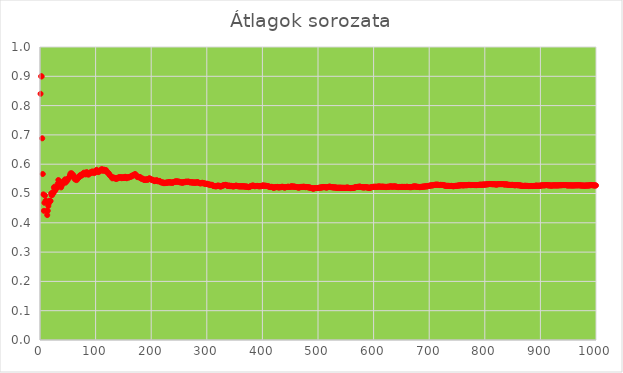
| Category | Series 0 |
|---|---|
| 1.0 | 0.84 |
| 2.0 | 0.9 |
| 3.0 | 0.899 |
| 4.0 | 0.688 |
| 5.0 | 0.566 |
| 6.0 | 0.497 |
| 7.0 | 0.441 |
| 8.0 | 0.468 |
| 9.0 | 0.493 |
| 10.0 | 0.475 |
| 11.0 | 0.475 |
| 12.0 | 0.441 |
| 13.0 | 0.426 |
| 14.0 | 0.441 |
| 15.0 | 0.457 |
| 16.0 | 0.467 |
| 17.0 | 0.475 |
| 18.0 | 0.475 |
| 19.0 | 0.474 |
| 20.0 | 0.5 |
| 21.0 | 0.494 |
| 22.0 | 0.495 |
| 23.0 | 0.505 |
| 24.0 | 0.501 |
| 25.0 | 0.52 |
| 26.0 | 0.523 |
| 27.0 | 0.509 |
| 28.0 | 0.516 |
| 29.0 | 0.517 |
| 30.0 | 0.517 |
| 31.0 | 0.524 |
| 32.0 | 0.534 |
| 33.0 | 0.546 |
| 34.0 | 0.532 |
| 35.0 | 0.532 |
| 36.0 | 0.541 |
| 37.0 | 0.527 |
| 38.0 | 0.521 |
| 39.0 | 0.527 |
| 40.0 | 0.531 |
| 41.0 | 0.538 |
| 42.0 | 0.538 |
| 43.0 | 0.542 |
| 44.0 | 0.541 |
| 45.0 | 0.548 |
| 46.0 | 0.537 |
| 47.0 | 0.542 |
| 48.0 | 0.544 |
| 49.0 | 0.543 |
| 50.0 | 0.549 |
| 51.0 | 0.553 |
| 52.0 | 0.552 |
| 53.0 | 0.556 |
| 54.0 | 0.563 |
| 55.0 | 0.569 |
| 56.0 | 0.564 |
| 57.0 | 0.569 |
| 58.0 | 0.56 |
| 59.0 | 0.563 |
| 60.0 | 0.563 |
| 61.0 | 0.558 |
| 62.0 | 0.552 |
| 63.0 | 0.548 |
| 64.0 | 0.548 |
| 65.0 | 0.552 |
| 66.0 | 0.546 |
| 67.0 | 0.552 |
| 68.0 | 0.551 |
| 69.0 | 0.557 |
| 70.0 | 0.554 |
| 71.0 | 0.56 |
| 72.0 | 0.562 |
| 73.0 | 0.563 |
| 74.0 | 0.56 |
| 75.0 | 0.564 |
| 76.0 | 0.567 |
| 77.0 | 0.564 |
| 78.0 | 0.567 |
| 79.0 | 0.571 |
| 80.0 | 0.568 |
| 81.0 | 0.568 |
| 82.0 | 0.565 |
| 83.0 | 0.569 |
| 84.0 | 0.573 |
| 85.0 | 0.571 |
| 86.0 | 0.567 |
| 87.0 | 0.564 |
| 88.0 | 0.566 |
| 89.0 | 0.568 |
| 90.0 | 0.57 |
| 91.0 | 0.573 |
| 92.0 | 0.57 |
| 93.0 | 0.571 |
| 94.0 | 0.575 |
| 95.0 | 0.574 |
| 96.0 | 0.571 |
| 97.0 | 0.575 |
| 98.0 | 0.57 |
| 99.0 | 0.573 |
| 100.0 | 0.575 |
| 101.0 | 0.579 |
| 102.0 | 0.581 |
| 103.0 | 0.576 |
| 104.0 | 0.574 |
| 105.0 | 0.573 |
| 106.0 | 0.577 |
| 107.0 | 0.575 |
| 108.0 | 0.577 |
| 109.0 | 0.58 |
| 110.0 | 0.58 |
| 111.0 | 0.583 |
| 112.0 | 0.581 |
| 113.0 | 0.577 |
| 114.0 | 0.579 |
| 115.0 | 0.581 |
| 116.0 | 0.579 |
| 117.0 | 0.577 |
| 118.0 | 0.579 |
| 119.0 | 0.58 |
| 120.0 | 0.575 |
| 121.0 | 0.572 |
| 122.0 | 0.571 |
| 123.0 | 0.57 |
| 124.0 | 0.568 |
| 125.0 | 0.563 |
| 126.0 | 0.562 |
| 127.0 | 0.559 |
| 128.0 | 0.558 |
| 129.0 | 0.556 |
| 130.0 | 0.552 |
| 131.0 | 0.555 |
| 132.0 | 0.555 |
| 133.0 | 0.553 |
| 134.0 | 0.552 |
| 135.0 | 0.552 |
| 136.0 | 0.553 |
| 137.0 | 0.549 |
| 138.0 | 0.552 |
| 139.0 | 0.553 |
| 140.0 | 0.552 |
| 141.0 | 0.554 |
| 142.0 | 0.556 |
| 143.0 | 0.555 |
| 144.0 | 0.555 |
| 145.0 | 0.555 |
| 146.0 | 0.556 |
| 147.0 | 0.552 |
| 148.0 | 0.554 |
| 149.0 | 0.556 |
| 150.0 | 0.554 |
| 151.0 | 0.553 |
| 152.0 | 0.555 |
| 153.0 | 0.557 |
| 154.0 | 0.557 |
| 155.0 | 0.553 |
| 156.0 | 0.552 |
| 157.0 | 0.555 |
| 158.0 | 0.556 |
| 159.0 | 0.554 |
| 160.0 | 0.555 |
| 161.0 | 0.557 |
| 162.0 | 0.556 |
| 163.0 | 0.557 |
| 164.0 | 0.559 |
| 165.0 | 0.558 |
| 166.0 | 0.561 |
| 167.0 | 0.562 |
| 168.0 | 0.562 |
| 169.0 | 0.562 |
| 170.0 | 0.565 |
| 171.0 | 0.567 |
| 172.0 | 0.564 |
| 173.0 | 0.562 |
| 174.0 | 0.559 |
| 175.0 | 0.556 |
| 176.0 | 0.558 |
| 177.0 | 0.556 |
| 178.0 | 0.555 |
| 179.0 | 0.555 |
| 180.0 | 0.556 |
| 181.0 | 0.553 |
| 182.0 | 0.551 |
| 183.0 | 0.55 |
| 184.0 | 0.55 |
| 185.0 | 0.551 |
| 186.0 | 0.548 |
| 187.0 | 0.547 |
| 188.0 | 0.547 |
| 189.0 | 0.546 |
| 190.0 | 0.547 |
| 191.0 | 0.548 |
| 192.0 | 0.548 |
| 193.0 | 0.547 |
| 194.0 | 0.547 |
| 195.0 | 0.549 |
| 196.0 | 0.551 |
| 197.0 | 0.552 |
| 198.0 | 0.55 |
| 199.0 | 0.548 |
| 200.0 | 0.548 |
| 201.0 | 0.547 |
| 202.0 | 0.547 |
| 203.0 | 0.547 |
| 204.0 | 0.544 |
| 205.0 | 0.544 |
| 206.0 | 0.542 |
| 207.0 | 0.543 |
| 208.0 | 0.544 |
| 209.0 | 0.544 |
| 210.0 | 0.546 |
| 211.0 | 0.543 |
| 212.0 | 0.543 |
| 213.0 | 0.541 |
| 214.0 | 0.542 |
| 215.0 | 0.543 |
| 216.0 | 0.541 |
| 217.0 | 0.539 |
| 218.0 | 0.539 |
| 219.0 | 0.537 |
| 220.0 | 0.538 |
| 221.0 | 0.538 |
| 222.0 | 0.537 |
| 223.0 | 0.535 |
| 224.0 | 0.536 |
| 225.0 | 0.537 |
| 226.0 | 0.536 |
| 227.0 | 0.537 |
| 228.0 | 0.537 |
| 229.0 | 0.538 |
| 230.0 | 0.537 |
| 231.0 | 0.537 |
| 232.0 | 0.539 |
| 233.0 | 0.539 |
| 234.0 | 0.537 |
| 235.0 | 0.537 |
| 236.0 | 0.538 |
| 237.0 | 0.538 |
| 238.0 | 0.536 |
| 239.0 | 0.537 |
| 240.0 | 0.538 |
| 241.0 | 0.539 |
| 242.0 | 0.54 |
| 243.0 | 0.54 |
| 244.0 | 0.542 |
| 245.0 | 0.54 |
| 246.0 | 0.542 |
| 247.0 | 0.541 |
| 248.0 | 0.54 |
| 249.0 | 0.541 |
| 250.0 | 0.54 |
| 251.0 | 0.538 |
| 252.0 | 0.538 |
| 253.0 | 0.538 |
| 254.0 | 0.538 |
| 255.0 | 0.538 |
| 256.0 | 0.537 |
| 257.0 | 0.537 |
| 258.0 | 0.539 |
| 259.0 | 0.539 |
| 260.0 | 0.538 |
| 261.0 | 0.54 |
| 262.0 | 0.54 |
| 263.0 | 0.541 |
| 264.0 | 0.54 |
| 265.0 | 0.539 |
| 266.0 | 0.541 |
| 267.0 | 0.54 |
| 268.0 | 0.54 |
| 269.0 | 0.539 |
| 270.0 | 0.538 |
| 271.0 | 0.538 |
| 272.0 | 0.539 |
| 273.0 | 0.538 |
| 274.0 | 0.537 |
| 275.0 | 0.538 |
| 276.0 | 0.538 |
| 277.0 | 0.536 |
| 278.0 | 0.538 |
| 279.0 | 0.537 |
| 280.0 | 0.537 |
| 281.0 | 0.538 |
| 282.0 | 0.537 |
| 283.0 | 0.539 |
| 284.0 | 0.538 |
| 285.0 | 0.537 |
| 286.0 | 0.536 |
| 287.0 | 0.536 |
| 288.0 | 0.534 |
| 289.0 | 0.536 |
| 290.0 | 0.535 |
| 291.0 | 0.536 |
| 292.0 | 0.537 |
| 293.0 | 0.536 |
| 294.0 | 0.534 |
| 295.0 | 0.534 |
| 296.0 | 0.535 |
| 297.0 | 0.533 |
| 298.0 | 0.532 |
| 299.0 | 0.532 |
| 300.0 | 0.534 |
| 301.0 | 0.533 |
| 302.0 | 0.531 |
| 303.0 | 0.531 |
| 304.0 | 0.531 |
| 305.0 | 0.53 |
| 306.0 | 0.53 |
| 307.0 | 0.529 |
| 308.0 | 0.529 |
| 309.0 | 0.53 |
| 310.0 | 0.528 |
| 311.0 | 0.527 |
| 312.0 | 0.525 |
| 313.0 | 0.526 |
| 314.0 | 0.526 |
| 315.0 | 0.524 |
| 316.0 | 0.525 |
| 317.0 | 0.524 |
| 318.0 | 0.525 |
| 319.0 | 0.527 |
| 320.0 | 0.526 |
| 321.0 | 0.527 |
| 322.0 | 0.526 |
| 323.0 | 0.525 |
| 324.0 | 0.524 |
| 325.0 | 0.524 |
| 326.0 | 0.525 |
| 327.0 | 0.526 |
| 328.0 | 0.527 |
| 329.0 | 0.527 |
| 330.0 | 0.528 |
| 331.0 | 0.528 |
| 332.0 | 0.529 |
| 333.0 | 0.529 |
| 334.0 | 0.53 |
| 335.0 | 0.528 |
| 336.0 | 0.528 |
| 337.0 | 0.526 |
| 338.0 | 0.525 |
| 339.0 | 0.527 |
| 340.0 | 0.527 |
| 341.0 | 0.526 |
| 342.0 | 0.525 |
| 343.0 | 0.526 |
| 344.0 | 0.526 |
| 345.0 | 0.525 |
| 346.0 | 0.525 |
| 347.0 | 0.524 |
| 348.0 | 0.525 |
| 349.0 | 0.524 |
| 350.0 | 0.525 |
| 351.0 | 0.525 |
| 352.0 | 0.526 |
| 353.0 | 0.527 |
| 354.0 | 0.526 |
| 355.0 | 0.526 |
| 356.0 | 0.525 |
| 357.0 | 0.525 |
| 358.0 | 0.524 |
| 359.0 | 0.525 |
| 360.0 | 0.524 |
| 361.0 | 0.525 |
| 362.0 | 0.525 |
| 363.0 | 0.524 |
| 364.0 | 0.525 |
| 365.0 | 0.524 |
| 366.0 | 0.525 |
| 367.0 | 0.524 |
| 368.0 | 0.524 |
| 369.0 | 0.524 |
| 370.0 | 0.524 |
| 371.0 | 0.524 |
| 372.0 | 0.523 |
| 373.0 | 0.523 |
| 374.0 | 0.523 |
| 375.0 | 0.522 |
| 376.0 | 0.522 |
| 377.0 | 0.523 |
| 378.0 | 0.524 |
| 379.0 | 0.525 |
| 380.0 | 0.525 |
| 381.0 | 0.526 |
| 382.0 | 0.527 |
| 383.0 | 0.527 |
| 384.0 | 0.527 |
| 385.0 | 0.526 |
| 386.0 | 0.525 |
| 387.0 | 0.525 |
| 388.0 | 0.525 |
| 389.0 | 0.526 |
| 390.0 | 0.526 |
| 391.0 | 0.526 |
| 392.0 | 0.525 |
| 393.0 | 0.525 |
| 394.0 | 0.524 |
| 395.0 | 0.525 |
| 396.0 | 0.525 |
| 397.0 | 0.525 |
| 398.0 | 0.525 |
| 399.0 | 0.526 |
| 400.0 | 0.527 |
| 401.0 | 0.528 |
| 402.0 | 0.527 |
| 403.0 | 0.526 |
| 404.0 | 0.526 |
| 405.0 | 0.527 |
| 406.0 | 0.526 |
| 407.0 | 0.526 |
| 408.0 | 0.526 |
| 409.0 | 0.525 |
| 410.0 | 0.525 |
| 411.0 | 0.524 |
| 412.0 | 0.524 |
| 413.0 | 0.523 |
| 414.0 | 0.522 |
| 415.0 | 0.523 |
| 416.0 | 0.523 |
| 417.0 | 0.523 |
| 418.0 | 0.522 |
| 419.0 | 0.521 |
| 420.0 | 0.52 |
| 421.0 | 0.521 |
| 422.0 | 0.52 |
| 423.0 | 0.521 |
| 424.0 | 0.522 |
| 425.0 | 0.522 |
| 426.0 | 0.522 |
| 427.0 | 0.523 |
| 428.0 | 0.522 |
| 429.0 | 0.52 |
| 430.0 | 0.521 |
| 431.0 | 0.522 |
| 432.0 | 0.522 |
| 433.0 | 0.521 |
| 434.0 | 0.522 |
| 435.0 | 0.523 |
| 436.0 | 0.522 |
| 437.0 | 0.523 |
| 438.0 | 0.522 |
| 439.0 | 0.521 |
| 440.0 | 0.52 |
| 441.0 | 0.521 |
| 442.0 | 0.522 |
| 443.0 | 0.522 |
| 444.0 | 0.522 |
| 445.0 | 0.523 |
| 446.0 | 0.523 |
| 447.0 | 0.523 |
| 448.0 | 0.523 |
| 449.0 | 0.522 |
| 450.0 | 0.523 |
| 451.0 | 0.523 |
| 452.0 | 0.524 |
| 453.0 | 0.524 |
| 454.0 | 0.523 |
| 455.0 | 0.524 |
| 456.0 | 0.523 |
| 457.0 | 0.524 |
| 458.0 | 0.523 |
| 459.0 | 0.522 |
| 460.0 | 0.523 |
| 461.0 | 0.522 |
| 462.0 | 0.522 |
| 463.0 | 0.521 |
| 464.0 | 0.521 |
| 465.0 | 0.52 |
| 466.0 | 0.521 |
| 467.0 | 0.521 |
| 468.0 | 0.522 |
| 469.0 | 0.522 |
| 470.0 | 0.523 |
| 471.0 | 0.522 |
| 472.0 | 0.522 |
| 473.0 | 0.523 |
| 474.0 | 0.523 |
| 475.0 | 0.523 |
| 476.0 | 0.523 |
| 477.0 | 0.522 |
| 478.0 | 0.522 |
| 479.0 | 0.522 |
| 480.0 | 0.522 |
| 481.0 | 0.522 |
| 482.0 | 0.521 |
| 483.0 | 0.521 |
| 484.0 | 0.521 |
| 485.0 | 0.52 |
| 486.0 | 0.52 |
| 487.0 | 0.519 |
| 488.0 | 0.519 |
| 489.0 | 0.518 |
| 490.0 | 0.518 |
| 491.0 | 0.517 |
| 492.0 | 0.517 |
| 493.0 | 0.517 |
| 494.0 | 0.518 |
| 495.0 | 0.518 |
| 496.0 | 0.519 |
| 497.0 | 0.519 |
| 498.0 | 0.519 |
| 499.0 | 0.518 |
| 500.0 | 0.519 |
| 501.0 | 0.519 |
| 502.0 | 0.52 |
| 503.0 | 0.52 |
| 504.0 | 0.52 |
| 505.0 | 0.52 |
| 506.0 | 0.521 |
| 507.0 | 0.521 |
| 508.0 | 0.521 |
| 509.0 | 0.522 |
| 510.0 | 0.522 |
| 511.0 | 0.522 |
| 512.0 | 0.522 |
| 513.0 | 0.522 |
| 514.0 | 0.521 |
| 515.0 | 0.52 |
| 516.0 | 0.521 |
| 517.0 | 0.521 |
| 518.0 | 0.522 |
| 519.0 | 0.522 |
| 520.0 | 0.523 |
| 521.0 | 0.523 |
| 522.0 | 0.523 |
| 523.0 | 0.522 |
| 524.0 | 0.521 |
| 525.0 | 0.522 |
| 526.0 | 0.521 |
| 527.0 | 0.521 |
| 528.0 | 0.52 |
| 529.0 | 0.521 |
| 530.0 | 0.521 |
| 531.0 | 0.52 |
| 532.0 | 0.521 |
| 533.0 | 0.52 |
| 534.0 | 0.519 |
| 535.0 | 0.52 |
| 536.0 | 0.52 |
| 537.0 | 0.52 |
| 538.0 | 0.519 |
| 539.0 | 0.52 |
| 540.0 | 0.52 |
| 541.0 | 0.52 |
| 542.0 | 0.519 |
| 543.0 | 0.519 |
| 544.0 | 0.52 |
| 545.0 | 0.519 |
| 546.0 | 0.52 |
| 547.0 | 0.519 |
| 548.0 | 0.519 |
| 549.0 | 0.519 |
| 550.0 | 0.52 |
| 551.0 | 0.519 |
| 552.0 | 0.52 |
| 553.0 | 0.521 |
| 554.0 | 0.52 |
| 555.0 | 0.519 |
| 556.0 | 0.519 |
| 557.0 | 0.519 |
| 558.0 | 0.519 |
| 559.0 | 0.518 |
| 560.0 | 0.519 |
| 561.0 | 0.519 |
| 562.0 | 0.519 |
| 563.0 | 0.519 |
| 564.0 | 0.519 |
| 565.0 | 0.52 |
| 566.0 | 0.52 |
| 567.0 | 0.521 |
| 568.0 | 0.522 |
| 569.0 | 0.522 |
| 570.0 | 0.522 |
| 571.0 | 0.523 |
| 572.0 | 0.522 |
| 573.0 | 0.523 |
| 574.0 | 0.523 |
| 575.0 | 0.524 |
| 576.0 | 0.523 |
| 577.0 | 0.522 |
| 578.0 | 0.522 |
| 579.0 | 0.521 |
| 580.0 | 0.522 |
| 581.0 | 0.521 |
| 582.0 | 0.52 |
| 583.0 | 0.521 |
| 584.0 | 0.521 |
| 585.0 | 0.521 |
| 586.0 | 0.522 |
| 587.0 | 0.522 |
| 588.0 | 0.521 |
| 589.0 | 0.52 |
| 590.0 | 0.52 |
| 591.0 | 0.52 |
| 592.0 | 0.519 |
| 593.0 | 0.519 |
| 594.0 | 0.52 |
| 595.0 | 0.521 |
| 596.0 | 0.521 |
| 597.0 | 0.522 |
| 598.0 | 0.522 |
| 599.0 | 0.523 |
| 600.0 | 0.523 |
| 601.0 | 0.523 |
| 602.0 | 0.522 |
| 603.0 | 0.523 |
| 604.0 | 0.523 |
| 605.0 | 0.523 |
| 606.0 | 0.522 |
| 607.0 | 0.523 |
| 608.0 | 0.524 |
| 609.0 | 0.524 |
| 610.0 | 0.524 |
| 611.0 | 0.523 |
| 612.0 | 0.523 |
| 613.0 | 0.523 |
| 614.0 | 0.523 |
| 615.0 | 0.523 |
| 616.0 | 0.523 |
| 617.0 | 0.523 |
| 618.0 | 0.523 |
| 619.0 | 0.522 |
| 620.0 | 0.523 |
| 621.0 | 0.523 |
| 622.0 | 0.522 |
| 623.0 | 0.522 |
| 624.0 | 0.523 |
| 625.0 | 0.523 |
| 626.0 | 0.523 |
| 627.0 | 0.523 |
| 628.0 | 0.523 |
| 629.0 | 0.524 |
| 630.0 | 0.524 |
| 631.0 | 0.524 |
| 632.0 | 0.524 |
| 633.0 | 0.523 |
| 634.0 | 0.523 |
| 635.0 | 0.524 |
| 636.0 | 0.524 |
| 637.0 | 0.524 |
| 638.0 | 0.524 |
| 639.0 | 0.524 |
| 640.0 | 0.524 |
| 641.0 | 0.523 |
| 642.0 | 0.523 |
| 643.0 | 0.522 |
| 644.0 | 0.522 |
| 645.0 | 0.522 |
| 646.0 | 0.522 |
| 647.0 | 0.523 |
| 648.0 | 0.522 |
| 649.0 | 0.522 |
| 650.0 | 0.522 |
| 651.0 | 0.523 |
| 652.0 | 0.522 |
| 653.0 | 0.522 |
| 654.0 | 0.522 |
| 655.0 | 0.523 |
| 656.0 | 0.522 |
| 657.0 | 0.522 |
| 658.0 | 0.523 |
| 659.0 | 0.522 |
| 660.0 | 0.523 |
| 661.0 | 0.523 |
| 662.0 | 0.522 |
| 663.0 | 0.522 |
| 664.0 | 0.522 |
| 665.0 | 0.522 |
| 666.0 | 0.522 |
| 667.0 | 0.522 |
| 668.0 | 0.522 |
| 669.0 | 0.523 |
| 670.0 | 0.523 |
| 671.0 | 0.523 |
| 672.0 | 0.524 |
| 673.0 | 0.524 |
| 674.0 | 0.524 |
| 675.0 | 0.524 |
| 676.0 | 0.524 |
| 677.0 | 0.523 |
| 678.0 | 0.523 |
| 679.0 | 0.523 |
| 680.0 | 0.522 |
| 681.0 | 0.523 |
| 682.0 | 0.522 |
| 683.0 | 0.522 |
| 684.0 | 0.522 |
| 685.0 | 0.523 |
| 686.0 | 0.522 |
| 687.0 | 0.523 |
| 688.0 | 0.523 |
| 689.0 | 0.524 |
| 690.0 | 0.523 |
| 691.0 | 0.523 |
| 692.0 | 0.524 |
| 693.0 | 0.524 |
| 694.0 | 0.525 |
| 695.0 | 0.524 |
| 696.0 | 0.524 |
| 697.0 | 0.525 |
| 698.0 | 0.525 |
| 699.0 | 0.526 |
| 700.0 | 0.526 |
| 701.0 | 0.527 |
| 702.0 | 0.527 |
| 703.0 | 0.528 |
| 704.0 | 0.528 |
| 705.0 | 0.528 |
| 706.0 | 0.528 |
| 707.0 | 0.528 |
| 708.0 | 0.529 |
| 709.0 | 0.529 |
| 710.0 | 0.53 |
| 711.0 | 0.53 |
| 712.0 | 0.53 |
| 713.0 | 0.53 |
| 714.0 | 0.53 |
| 715.0 | 0.53 |
| 716.0 | 0.53 |
| 717.0 | 0.529 |
| 718.0 | 0.529 |
| 719.0 | 0.529 |
| 720.0 | 0.529 |
| 721.0 | 0.53 |
| 722.0 | 0.529 |
| 723.0 | 0.529 |
| 724.0 | 0.529 |
| 725.0 | 0.529 |
| 726.0 | 0.528 |
| 727.0 | 0.528 |
| 728.0 | 0.527 |
| 729.0 | 0.527 |
| 730.0 | 0.526 |
| 731.0 | 0.526 |
| 732.0 | 0.526 |
| 733.0 | 0.527 |
| 734.0 | 0.526 |
| 735.0 | 0.526 |
| 736.0 | 0.526 |
| 737.0 | 0.526 |
| 738.0 | 0.526 |
| 739.0 | 0.526 |
| 740.0 | 0.526 |
| 741.0 | 0.526 |
| 742.0 | 0.525 |
| 743.0 | 0.525 |
| 744.0 | 0.525 |
| 745.0 | 0.525 |
| 746.0 | 0.526 |
| 747.0 | 0.526 |
| 748.0 | 0.526 |
| 749.0 | 0.526 |
| 750.0 | 0.526 |
| 751.0 | 0.527 |
| 752.0 | 0.527 |
| 753.0 | 0.527 |
| 754.0 | 0.528 |
| 755.0 | 0.528 |
| 756.0 | 0.528 |
| 757.0 | 0.528 |
| 758.0 | 0.529 |
| 759.0 | 0.528 |
| 760.0 | 0.528 |
| 761.0 | 0.528 |
| 762.0 | 0.528 |
| 763.0 | 0.528 |
| 764.0 | 0.528 |
| 765.0 | 0.528 |
| 766.0 | 0.528 |
| 767.0 | 0.528 |
| 768.0 | 0.528 |
| 769.0 | 0.529 |
| 770.0 | 0.529 |
| 771.0 | 0.529 |
| 772.0 | 0.529 |
| 773.0 | 0.529 |
| 774.0 | 0.529 |
| 775.0 | 0.529 |
| 776.0 | 0.529 |
| 777.0 | 0.529 |
| 778.0 | 0.529 |
| 779.0 | 0.529 |
| 780.0 | 0.529 |
| 781.0 | 0.529 |
| 782.0 | 0.528 |
| 783.0 | 0.529 |
| 784.0 | 0.529 |
| 785.0 | 0.528 |
| 786.0 | 0.529 |
| 787.0 | 0.529 |
| 788.0 | 0.529 |
| 789.0 | 0.529 |
| 790.0 | 0.529 |
| 791.0 | 0.53 |
| 792.0 | 0.53 |
| 793.0 | 0.53 |
| 794.0 | 0.53 |
| 795.0 | 0.53 |
| 796.0 | 0.53 |
| 797.0 | 0.53 |
| 798.0 | 0.53 |
| 799.0 | 0.531 |
| 800.0 | 0.53 |
| 801.0 | 0.531 |
| 802.0 | 0.531 |
| 803.0 | 0.531 |
| 804.0 | 0.531 |
| 805.0 | 0.531 |
| 806.0 | 0.532 |
| 807.0 | 0.532 |
| 808.0 | 0.533 |
| 809.0 | 0.532 |
| 810.0 | 0.532 |
| 811.0 | 0.532 |
| 812.0 | 0.532 |
| 813.0 | 0.532 |
| 814.0 | 0.531 |
| 815.0 | 0.532 |
| 816.0 | 0.532 |
| 817.0 | 0.532 |
| 818.0 | 0.532 |
| 819.0 | 0.531 |
| 820.0 | 0.531 |
| 821.0 | 0.531 |
| 822.0 | 0.531 |
| 823.0 | 0.531 |
| 824.0 | 0.532 |
| 825.0 | 0.532 |
| 826.0 | 0.532 |
| 827.0 | 0.532 |
| 828.0 | 0.532 |
| 829.0 | 0.532 |
| 830.0 | 0.532 |
| 831.0 | 0.532 |
| 832.0 | 0.532 |
| 833.0 | 0.532 |
| 834.0 | 0.531 |
| 835.0 | 0.531 |
| 836.0 | 0.531 |
| 837.0 | 0.531 |
| 838.0 | 0.531 |
| 839.0 | 0.531 |
| 840.0 | 0.53 |
| 841.0 | 0.53 |
| 842.0 | 0.53 |
| 843.0 | 0.529 |
| 844.0 | 0.529 |
| 845.0 | 0.53 |
| 846.0 | 0.529 |
| 847.0 | 0.529 |
| 848.0 | 0.529 |
| 849.0 | 0.529 |
| 850.0 | 0.53 |
| 851.0 | 0.529 |
| 852.0 | 0.529 |
| 853.0 | 0.528 |
| 854.0 | 0.528 |
| 855.0 | 0.528 |
| 856.0 | 0.528 |
| 857.0 | 0.529 |
| 858.0 | 0.529 |
| 859.0 | 0.528 |
| 860.0 | 0.528 |
| 861.0 | 0.528 |
| 862.0 | 0.528 |
| 863.0 | 0.528 |
| 864.0 | 0.527 |
| 865.0 | 0.527 |
| 866.0 | 0.526 |
| 867.0 | 0.526 |
| 868.0 | 0.526 |
| 869.0 | 0.526 |
| 870.0 | 0.526 |
| 871.0 | 0.526 |
| 872.0 | 0.526 |
| 873.0 | 0.526 |
| 874.0 | 0.526 |
| 875.0 | 0.526 |
| 876.0 | 0.526 |
| 877.0 | 0.526 |
| 878.0 | 0.526 |
| 879.0 | 0.525 |
| 880.0 | 0.525 |
| 881.0 | 0.526 |
| 882.0 | 0.525 |
| 883.0 | 0.526 |
| 884.0 | 0.526 |
| 885.0 | 0.526 |
| 886.0 | 0.525 |
| 887.0 | 0.525 |
| 888.0 | 0.526 |
| 889.0 | 0.526 |
| 890.0 | 0.526 |
| 891.0 | 0.526 |
| 892.0 | 0.527 |
| 893.0 | 0.527 |
| 894.0 | 0.526 |
| 895.0 | 0.526 |
| 896.0 | 0.526 |
| 897.0 | 0.527 |
| 898.0 | 0.526 |
| 899.0 | 0.526 |
| 900.0 | 0.527 |
| 901.0 | 0.527 |
| 902.0 | 0.527 |
| 903.0 | 0.528 |
| 904.0 | 0.528 |
| 905.0 | 0.528 |
| 906.0 | 0.528 |
| 907.0 | 0.528 |
| 908.0 | 0.528 |
| 909.0 | 0.528 |
| 910.0 | 0.529 |
| 911.0 | 0.529 |
| 912.0 | 0.529 |
| 913.0 | 0.528 |
| 914.0 | 0.528 |
| 915.0 | 0.528 |
| 916.0 | 0.528 |
| 917.0 | 0.528 |
| 918.0 | 0.527 |
| 919.0 | 0.527 |
| 920.0 | 0.527 |
| 921.0 | 0.527 |
| 922.0 | 0.528 |
| 923.0 | 0.528 |
| 924.0 | 0.528 |
| 925.0 | 0.528 |
| 926.0 | 0.528 |
| 927.0 | 0.527 |
| 928.0 | 0.528 |
| 929.0 | 0.528 |
| 930.0 | 0.528 |
| 931.0 | 0.528 |
| 932.0 | 0.527 |
| 933.0 | 0.528 |
| 934.0 | 0.528 |
| 935.0 | 0.528 |
| 936.0 | 0.529 |
| 937.0 | 0.528 |
| 938.0 | 0.528 |
| 939.0 | 0.529 |
| 940.0 | 0.528 |
| 941.0 | 0.529 |
| 942.0 | 0.529 |
| 943.0 | 0.528 |
| 944.0 | 0.529 |
| 945.0 | 0.529 |
| 946.0 | 0.529 |
| 947.0 | 0.528 |
| 948.0 | 0.528 |
| 949.0 | 0.528 |
| 950.0 | 0.528 |
| 951.0 | 0.528 |
| 952.0 | 0.528 |
| 953.0 | 0.528 |
| 954.0 | 0.528 |
| 955.0 | 0.528 |
| 956.0 | 0.528 |
| 957.0 | 0.527 |
| 958.0 | 0.527 |
| 959.0 | 0.528 |
| 960.0 | 0.527 |
| 961.0 | 0.528 |
| 962.0 | 0.528 |
| 963.0 | 0.528 |
| 964.0 | 0.528 |
| 965.0 | 0.528 |
| 966.0 | 0.528 |
| 967.0 | 0.528 |
| 968.0 | 0.528 |
| 969.0 | 0.528 |
| 970.0 | 0.528 |
| 971.0 | 0.528 |
| 972.0 | 0.528 |
| 973.0 | 0.527 |
| 974.0 | 0.527 |
| 975.0 | 0.527 |
| 976.0 | 0.527 |
| 977.0 | 0.527 |
| 978.0 | 0.527 |
| 979.0 | 0.527 |
| 980.0 | 0.527 |
| 981.0 | 0.527 |
| 982.0 | 0.527 |
| 983.0 | 0.527 |
| 984.0 | 0.527 |
| 985.0 | 0.527 |
| 986.0 | 0.527 |
| 987.0 | 0.527 |
| 988.0 | 0.528 |
| 989.0 | 0.528 |
| 990.0 | 0.528 |
| 991.0 | 0.529 |
| 992.0 | 0.529 |
| 993.0 | 0.528 |
| 994.0 | 0.528 |
| 995.0 | 0.528 |
| 996.0 | 0.528 |
| 997.0 | 0.527 |
| 998.0 | 0.528 |
| 999.0 | 0.527 |
| 1000.0 | 0.528 |